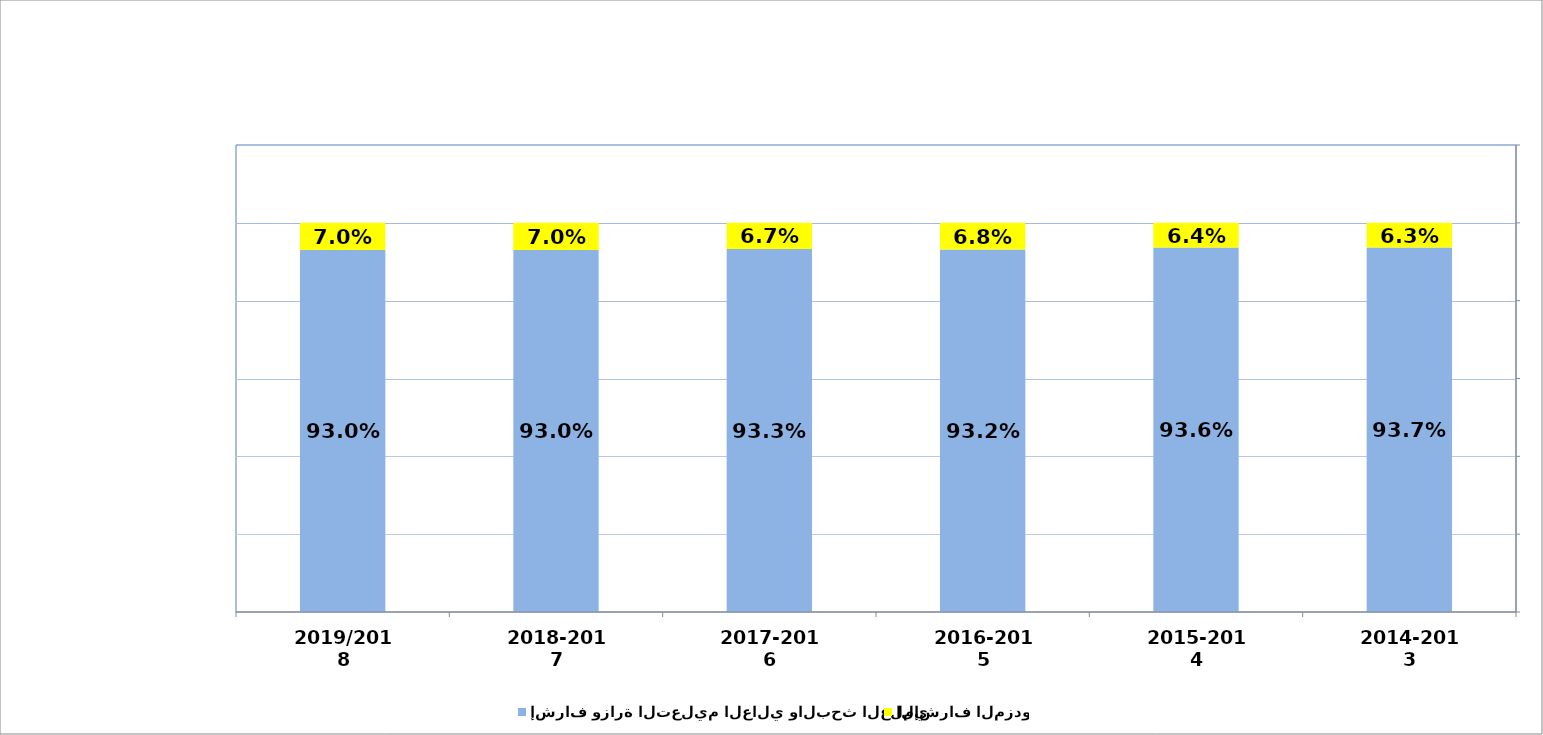
| Category | إشراف وزارة التعليم العالي والبحث العلمي  | الإشراف المزدوج |
|---|---|---|
| 2014-2013 | 0.937 | 0.063 |
| 2015-2014 | 0.936 | 0.064 |
| 2016-2015 | 0.932 | 0.068 |
| 2017-2016 | 0.933 | 0.067 |
| 2018-2017 | 0.93 | 0.07 |
| 2019/2018 | 0.93 | 0.07 |